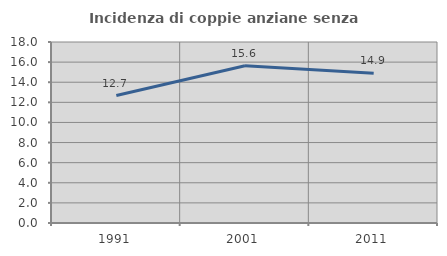
| Category | Incidenza di coppie anziane senza figli  |
|---|---|
| 1991.0 | 12.678 |
| 2001.0 | 15.64 |
| 2011.0 | 14.891 |